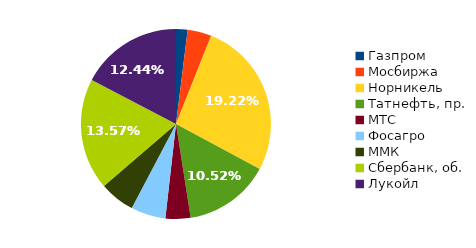
| Category | Series 0 |
|---|---|
| Газпром | 0.014 |
| Мосбиржа | 0.029 |
| Норникель | 0.192 |
| Татнефть, пр. | 0.105 |
| МТС | 0.031 |
| Фосагро | 0.042 |
| ММК | 0.043 |
| Сбербанк, об. | 0.136 |
| Лукойл | 0.124 |